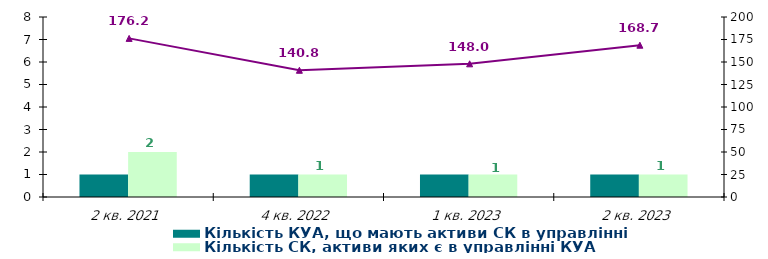
| Category | Кількість КУА, що мають активи СК в управлінні | Кількість СК, активи яких є в управлінні КУА |
|---|---|---|
| 2 кв. 2021 | 1 | 2 |
| 4 кв. 2022 | 1 | 1 |
| 1 кв. 2023 | 1 | 1 |
| 2 кв. 2023 | 1 | 1 |